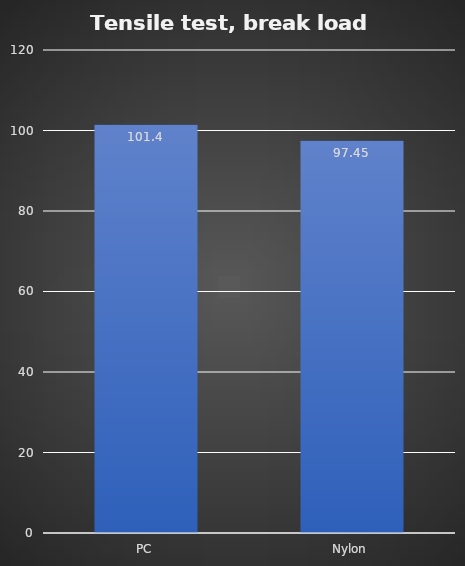
| Category | Average (kg) |
|---|---|
| PC | 101.4 |
| Nylon | 97.45 |